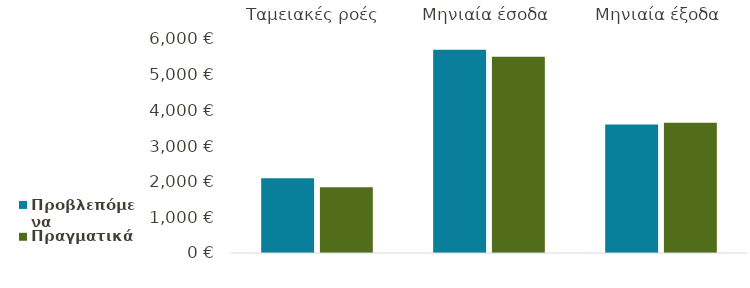
| Category | Προβλεπόμενα | Πραγματικά |
|---|---|---|
| Ταμειακές ροές | 2097 | 1845 |
| Μηνιαία έσοδα | 5700 | 5500 |
| Μηνιαία έξοδα | 3603 | 3655 |